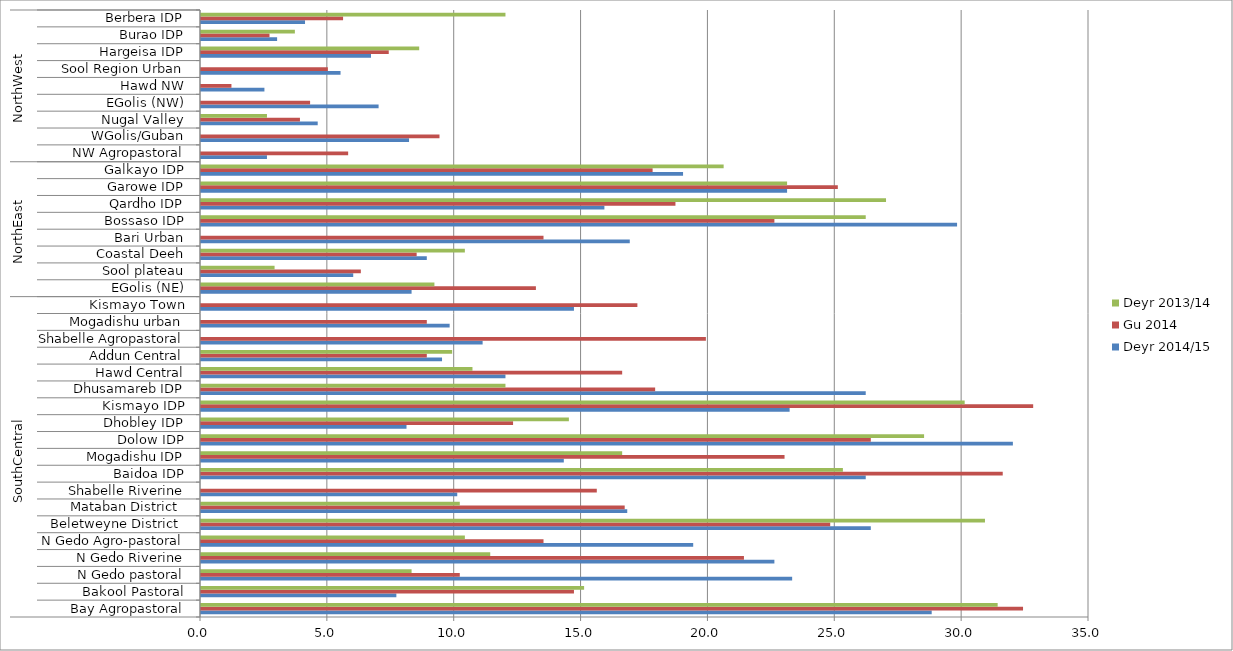
| Category | Deyr 2014/15 | Gu 2014 | Deyr 2013/14 |
|---|---|---|---|
| 0 | 28.8 | 32.4 | 31.4 |
| 1 | 7.7 | 14.7 | 15.1 |
| 2 | 23.3 | 10.2 | 8.3 |
| 3 | 22.6 | 21.4 | 11.4 |
| 4 | 19.4 | 13.5 | 10.4 |
| 5 | 26.4 | 24.8 | 30.9 |
| 6 | 16.8 | 16.7 | 10.2 |
| 7 | 10.1 | 15.6 | 0 |
| 8 | 26.2 | 31.6 | 25.3 |
| 9 | 14.3 | 23 | 16.6 |
| 10 | 32 | 26.4 | 28.5 |
| 11 | 8.1 | 12.3 | 14.5 |
| 12 | 23.2 | 32.8 | 30.1 |
| 13 | 26.2 | 17.9 | 12 |
| 14 | 12 | 16.6 | 10.7 |
| 15 | 9.5 | 8.9 | 9.9 |
| 16 | 11.1 | 19.9 | 0 |
| 17 | 9.8 | 8.9 | 0 |
| 18 | 14.7 | 17.2 | 0 |
| 19 | 8.3 | 13.2 | 9.2 |
| 20 | 6 | 6.3 | 2.9 |
| 21 | 8.9 | 8.5 | 10.4 |
| 22 | 16.9 | 13.5 | 0 |
| 23 | 29.8 | 22.6 | 26.2 |
| 24 | 15.9 | 18.7 | 27 |
| 25 | 23.1 | 25.1 | 23.1 |
| 26 | 19 | 17.8 | 20.6 |
| 27 | 2.6 | 5.8 | 0 |
| 28 | 8.2 | 9.4 | 0 |
| 29 | 4.6 | 3.9 | 2.6 |
| 30 | 7 | 4.3 | 0 |
| 31 | 2.5 | 1.2 | 0 |
| 32 | 5.5 | 5 | 0 |
| 33 | 6.7 | 7.4 | 8.6 |
| 34 | 3 | 2.7 | 3.7 |
| 35 | 4.1 | 5.6 | 12 |